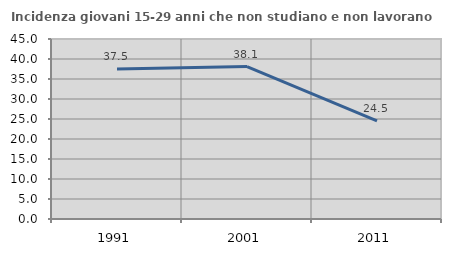
| Category | Incidenza giovani 15-29 anni che non studiano e non lavorano  |
|---|---|
| 1991.0 | 37.525 |
| 2001.0 | 38.111 |
| 2011.0 | 24.537 |